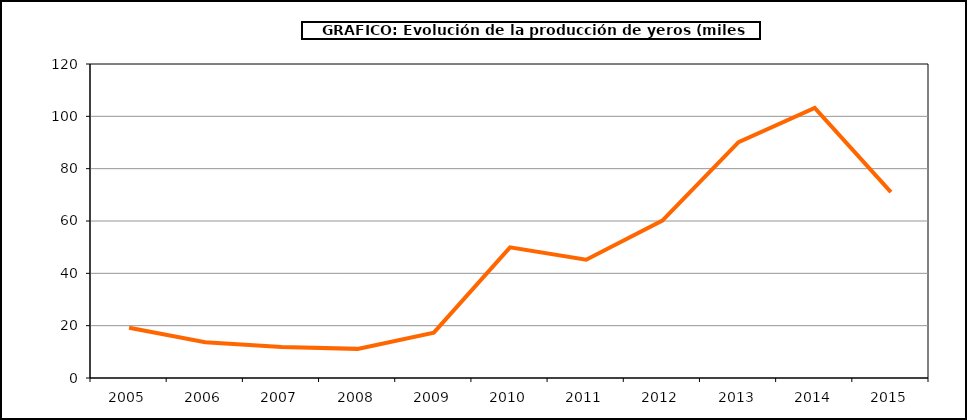
| Category | Producción |
|---|---|
| 2005.0 | 19.2 |
| 2006.0 | 13.632 |
| 2007.0 | 11.829 |
| 2008.0 | 11.131 |
| 2009.0 | 17.321 |
| 2010.0 | 49.937 |
| 2011.0 | 45.202 |
| 2012.0 | 60.147 |
| 2013.0 | 90.163 |
| 2014.0 | 103.242 |
| 2015.0 | 71.021 |